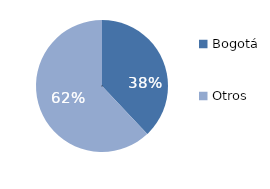
| Category | Series 0 |
|---|---|
| Bogotá | 37.975 |
| Otros | 62.025 |